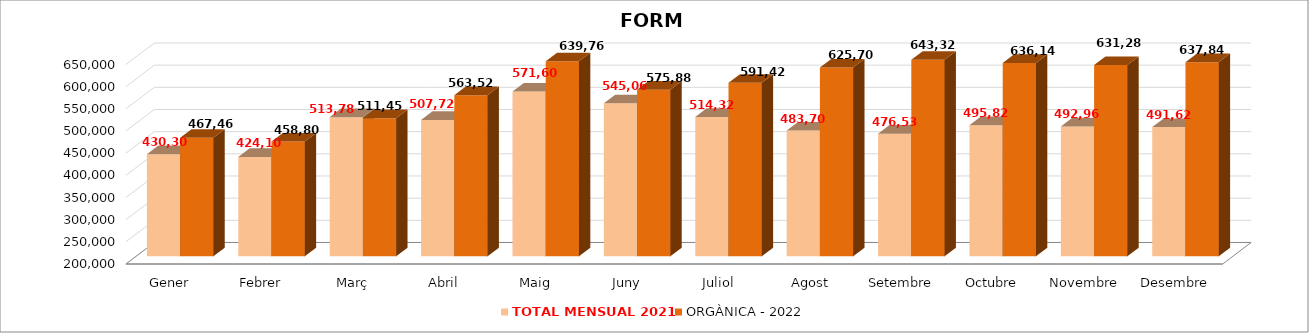
| Category | TOTAL MENSUAL 2021 | ORGÀNICA - 2022 |
|---|---|---|
| Gener | 430300 | 467460.01 |
| Febrer | 424100 | 458800 |
| Març | 513779.99 | 511459 |
| Abril | 507720 | 563520 |
| Maig | 571600.01 | 639760 |
| Juny | 545060 | 575880 |
| Juliol | 514319.99 | 591420 |
| Agost | 483699.99 | 625700 |
| Setembre | 476530 | 643320 |
| Octubre | 495820 | 636140 |
| Novembre | 492960 | 631280 |
| Desembre | 491620 | 637840 |